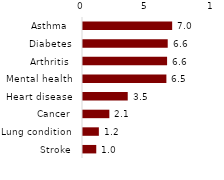
| Category | Series 0 |
|---|---|
| Asthma  | 6.966 |
| Diabetes | 6.619 |
| Arthritis  | 6.57 |
| Mental health | 6.515 |
| Heart disease | 3.494 |
| Cancer | 2.058 |
| Lung condition | 1.239 |
| Stroke | 1.036 |